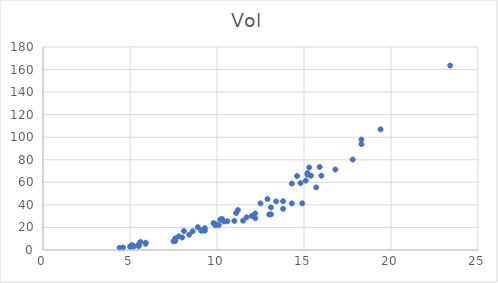
| Category | Vol |
|---|---|
| 4.4 | 2 |
| 4.6 | 2.2 |
| 5.0 | 3 |
| 5.1 | 4.3 |
| 5.1 | 3 |
| 5.2 | 2.9 |
| 5.2 | 3.5 |
| 5.5 | 3.4 |
| 5.5 | 5 |
| 5.6 | 7.2 |
| 5.9 | 6.4 |
| 5.9 | 5.6 |
| 7.5 | 7.7 |
| 7.6 | 10.3 |
| 7.6 | 8 |
| 7.8 | 12.1 |
| 8.0 | 11.1 |
| 8.1 | 16.8 |
| 8.4 | 13.6 |
| 8.6 | 16.6 |
| 8.9 | 20.2 |
| 9.1 | 17 |
| 9.2 | 17.7 |
| 9.3 | 19.4 |
| 9.3 | 17.1 |
| 9.8 | 23.9 |
| 9.9 | 22 |
| 9.9 | 23.1 |
| 9.9 | 22.6 |
| 10.1 | 22 |
| 10.2 | 27 |
| 10.2 | 27 |
| 10.3 | 27.4 |
| 10.4 | 25.2 |
| 10.6 | 25.5 |
| 11.0 | 25.8 |
| 11.1 | 32.8 |
| 11.2 | 35.4 |
| 11.5 | 26 |
| 11.7 | 29 |
| 12.0 | 30.2 |
| 12.2 | 28.2 |
| 12.2 | 32.4 |
| 12.5 | 41.3 |
| 12.9 | 45.2 |
| 13.0 | 31.5 |
| 13.1 | 37.8 |
| 13.1 | 31.6 |
| 13.4 | 43.1 |
| 13.8 | 36.5 |
| 13.8 | 43.3 |
| 14.3 | 41.3 |
| 14.3 | 58.9 |
| 14.6 | 65.6 |
| 14.8 | 59.3 |
| 14.9 | 41.4 |
| 15.1 | 61.5 |
| 15.2 | 66.7 |
| 15.2 | 68.2 |
| 15.3 | 73.2 |
| 15.4 | 65.9 |
| 15.7 | 55.5 |
| 15.9 | 73.6 |
| 16.0 | 65.9 |
| 16.8 | 71.4 |
| 17.8 | 80.2 |
| 18.3 | 93.8 |
| 18.3 | 97.9 |
| 19.4 | 107 |
| 23.4 | 163.5 |